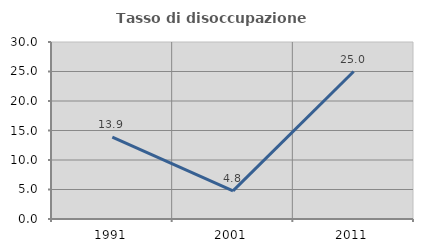
| Category | Tasso di disoccupazione giovanile  |
|---|---|
| 1991.0 | 13.889 |
| 2001.0 | 4.762 |
| 2011.0 | 25 |